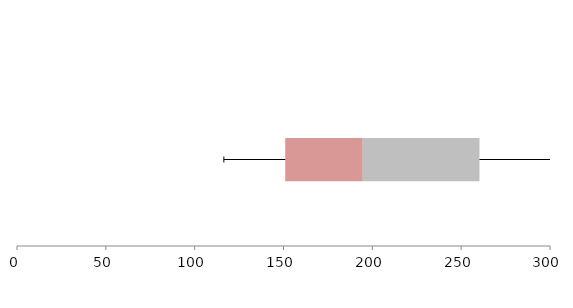
| Category | Series 1 | Series 2 | Series 3 |
|---|---|---|---|
| 0 | 150.981 | 43.634 | 65.695 |